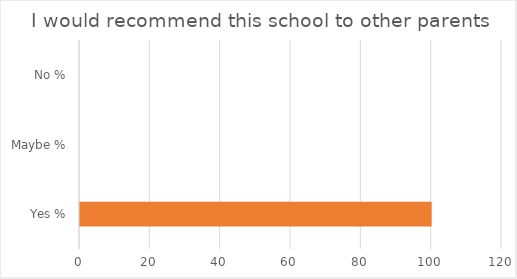
| Category | Series 0 |
|---|---|
| Yes % | 100 |
| Maybe % | 0 |
| No % | 0 |